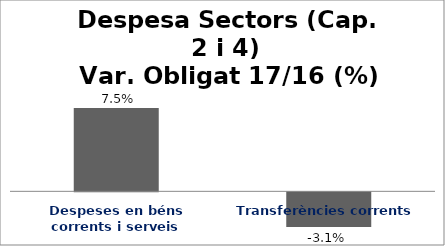
| Category | Series 0 |
|---|---|
| Despeses en béns corrents i serveis | 0.075 |
| Transferències corrents | -0.031 |